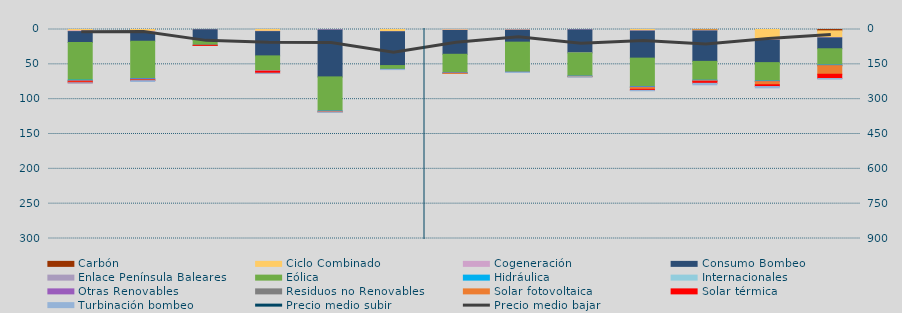
| Category | Carbón | Ciclo Combinado | Cogeneración | Consumo Bombeo | Enlace Península Baleares | Eólica | Hidráulica | Internacionales | Otras Renovables | Residuos no Renovables | Solar fotovoltaica | Solar térmica | Turbinación bombeo |
|---|---|---|---|---|---|---|---|---|---|---|---|---|---|
| 0 | 0 | 1918.5 | 1097.9 | 15644.8 | 0 | 53940 | 707.2 | 0 | 770.3 | 169.1 | 860.9 | 1341.3 | 386.7 |
| 1 | 0 | 2609.1 | 2181.9 | 11984 | 0 | 53740.1 | 489.7 | 0 | 1338.8 | 61.2 | 254.1 | 740.7 | 1229 |
| 2 | 0 | 263.3 | 58 | 15135.8 | 0 | 6986.8 | 204.2 | 0 | 0 | 0 | 19.1 | 10 | 0 |
| 3 | 0 | 2541.1 | 504.6 | 34828.6 | 0 | 20974.2 | 56.9 | 0 | 659.6 | 0 | 686.2 | 2480.3 | 253.2 |
| 4 | 0 | 0 | 686.4 | 67342.6 | 0 | 49071.7 | 271.7 | 0 | 794.5 | 0 | 557.9 | 0 | 259.9 |
| 5 | 0 | 3064.1 | 163.7 | 48534.4 | 0 | 5474.1 | 38.8 | 0 | 117.5 | 0 | 22.5 | 0 | 130 |
| 6 | 0 | 754.5 | 626.3 | 34195.3 | 0 | 26304.6 | 431 | 0 | 574.8 | 3.9 | 78.7 | 0 | 0 |
| 7 | 0 | 527.6 | 537.7 | 17096.8 | 0 | 43158.6 | 57.1 | 0 | 178.1 | 0 | 29.6 | 0 | 157.5 |
| 8 | 0 | 33.9 | 492.3 | 32860 | 204 | 33430.9 | 70.8 | 0 | 339.4 | 109.7 | 324.3 | 0 | 570.1 |
| 9 | 0 | 1823.5 | 445.3 | 38830 | 0 | 40976.3 | 479.9 | 0 | 886 | 0.2 | 2434.6 | 1489.3 | 549.6 |
| 10 | 543 | 1288.6 | 238.655 | 43678.268 | 0 | 27098.515 | 150.455 | 0 | 982.208 | 13.2 | 761.432 | 2474.8 | 2164.5 |
| 11 | 0 | 14634.199 | 838.098 | 32075.867 | 0 | 26340.743 | 533.073 | 0 | 507.085 | 0 | 4421.722 | 2509.099 | 1924.625 |
| 12 | 1932.082 | 9683.392 | 448.406 | 15579.715 | 0 | 23351.965 | 345.088 | 0 | 633.184 | 108.783 | 12157.29 | 6064.342 | 913.05 |